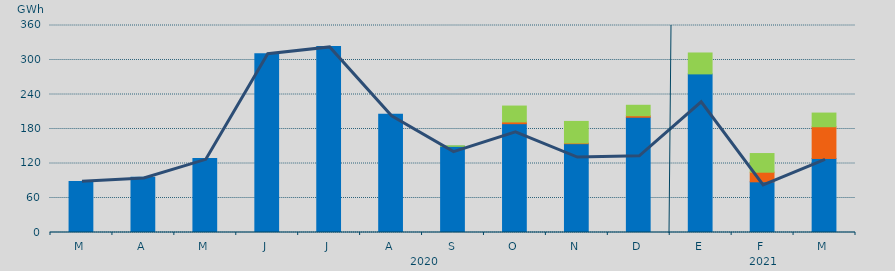
| Category | Asignación SEPE | Asignación Francia | Asignación Portugal |
|---|---|---|---|
| M | 88879.4 | 0 | 0 |
| A | 96111 | 0 | 0 |
| M | 128508 | 0 | 0 |
| J | 311078 | 0 | 0 |
| J | 323314 | 0 | 0 |
| A | 205758 | 0 | 0 |
| S | 149824 | 0 | 875 |
| O | 189238.4 | 3056.5 | 27606.6 |
| N | 154473.6 | 1071 | 37654.2 |
| D | 200440 | 2647 | 18165 |
| E | 275840.2 | 0 | 36360.3 |
| F | 88172.2 | 16686.7 | 32453.2 |
| M | 128766.4 | 55171.8 | 23771 |